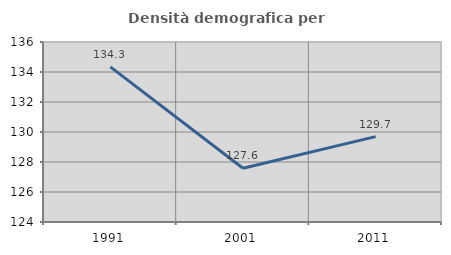
| Category | Densità demografica |
|---|---|
| 1991.0 | 134.339 |
| 2001.0 | 127.58 |
| 2011.0 | 129.692 |